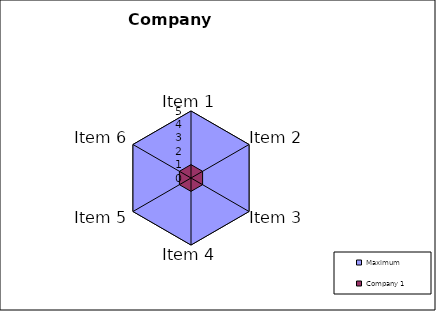
| Category | Maximum | Company 1 |
|---|---|---|
| Item 1 | 5 | 1 |
| Item 2 | 5 | 1 |
| Item 3 | 5 | 1 |
| Item 4 | 5 | 1 |
| Item 5 | 5 | 1 |
| Item 6 | 5 | 1 |